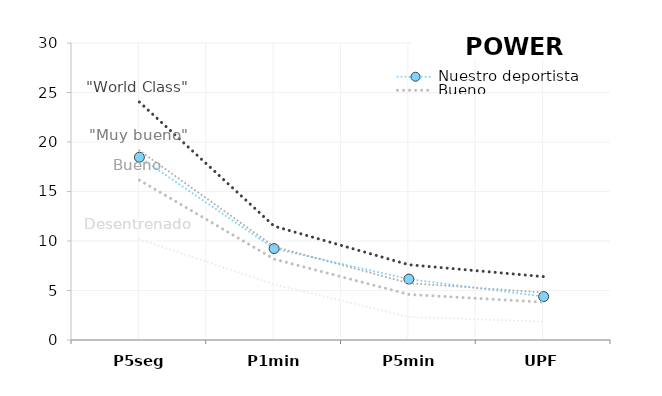
| Category | Nuestro deportista | "World Class" | "Muy bueno" | Bueno | Desentrenado |
|---|---|---|---|---|---|
| P5seg | 18.462 | 24.04 | 19.15 | 16.15 | 10.17 |
| P1min | 9.231 | 11.5 | 9.43 | 8.17 | 5.62 |
| P5min | 6.154 | 7.6 | 5.74 | 4.6 | 2.33 |
| UPF | 4.385 | 6.4 | 4.8 | 3.82 | 1.86 |